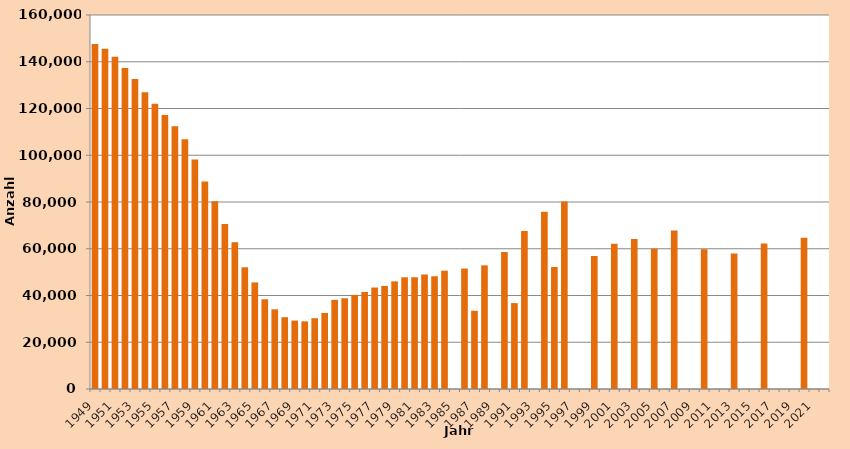
| Category | Series 1 |
|---|---|
| 1949.0 | 147586 |
| 1950.0 | 145593 |
| 1951.0 | 142126 |
| 1952.0 | 137303 |
| 1953.0 | 132634 |
| 1954.0 | 126916 |
| 1955.0 | 122062 |
| 1956.0 | 117166 |
| 1957.0 | 112452 |
| 1958.0 | 106874 |
| 1959.0 | 98161 |
| 1960.0 | 88732 |
| 1961.0 | 80336 |
| 1962.0 | 70568 |
| 1963.0 | 62733 |
| 1964.0 | 52064 |
| 1965.0 | 45601 |
| 1966.0 | 38383 |
| 1967.0 | 34089 |
| 1968.0 | 30706 |
| 1969.0 | 29274 |
| 1970.0 | 28933 |
| 1971.0 | 30276 |
| 1972.0 | 32536 |
| 1973.0 | 38141 |
| 1974.0 | 38818 |
| 1975.0 | 40267 |
| 1976.0 | 41511 |
| 1977.0 | 43404 |
| 1978.0 | 44078 |
| 1979.0 | 46050 |
| 1980.0 | 47794 |
| 1981.0 | 47814 |
| 1982.0 | 48985 |
| 1983.0 | 48231 |
| 1984.0 | 50615 |
| 1985.0 | 0 |
| 1986.0 | 51516 |
| 1987.0 | 33459 |
| 1988.0 | 52904 |
| 1989.0 | 0 |
| 1990.0 | 58651 |
| 1991.0 | 36751 |
| 1992.0 | 67635 |
| 1993.0 | 0 |
| 1994.0 | 75789 |
| 1995.0 | 52181 |
| 1996.0 | 80231 |
| 1997.0 | 0 |
| 1998.0 | 0 |
| 1999.0 | 56949 |
| 2000.0 | 0 |
| 2001.0 | 62171 |
| 2002.0 | 0 |
| 2003.0 | 64212 |
| 2004.0 | 0 |
| 2005.0 | 60000 |
| 2006.0 | 0 |
| 2007.0 | 67816 |
| 2008.0 | 0 |
| 2009.0 | 0 |
| 2010.0 | 59741 |
| 2011.0 | 0 |
| 2012.0 | 0 |
| 2013.0 | 58000 |
| 2014.0 | 0 |
| 2015.0 | 0 |
| 2016.0 | 62256 |
| 2017.0 | 0 |
| 2018.0 | 0 |
| 2019.0 | 0 |
| 2020.0 | 64759 |
| 2021.0 | 0 |
| 2022.0 | 0 |